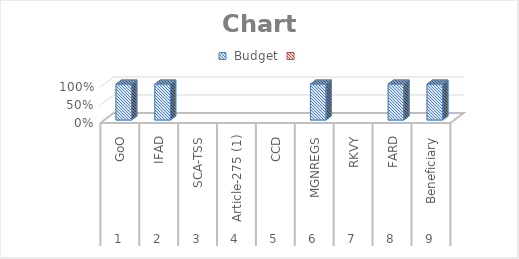
| Category |  Budget | Series 1 |
|---|---|---|
| 0 | 207729167 |  |
| 1 | 674757228 |  |
| 2 | 0 |  |
| 3 | 0 |  |
| 4 | 0 |  |
| 5 | 120401800 |  |
| 6 | 0 |  |
| 7 | 102320000 |  |
| 8 | 42756140 |  |